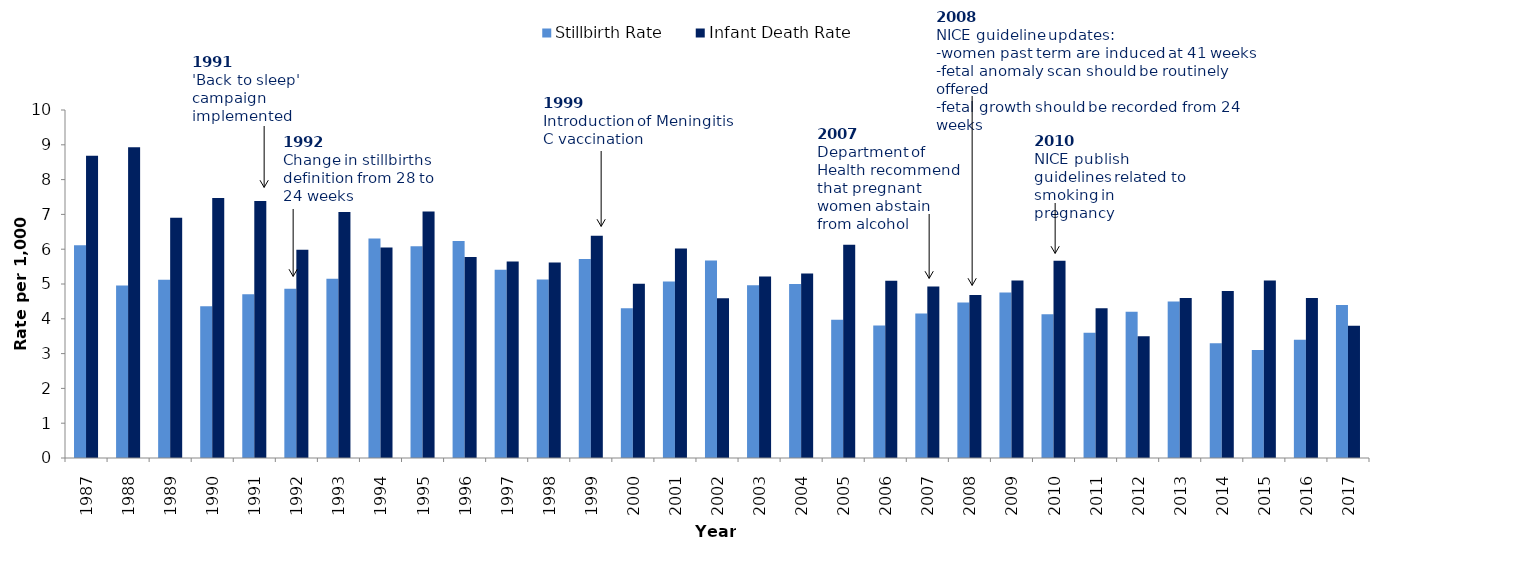
| Category | Stillbirth Rate | Infant Death Rate |
|---|---|---|
| 1987 | 6.11 | 8.685 |
| 1988 | 4.955 | 8.931 |
| 1989 | 5.122 | 6.902 |
| 1990 | 4.362 | 7.472 |
| 1991 | 4.703 | 7.386 |
| 1992 | 4.867 | 5.983 |
| 1993 | 5.151 | 7.066 |
| 1994 | 6.309 | 6.052 |
| 1995 | 6.083 | 7.083 |
| 1996 | 6.236 | 5.777 |
| 1997 | 5.409 | 5.643 |
| 1998 | 5.128 | 5.616 |
| 1999 | 5.717 | 6.387 |
| 2000 | 4.305 | 5.007 |
| 2001 | 5.074 | 6.022 |
| 2002 | 5.673 | 4.593 |
| 2003 | 4.964 | 5.214 |
| 2004 | 5 | 5.3 |
| 2005 | 3.97 | 6.128 |
| 2006 | 3.81 | 5.092 |
| 2007 | 4.154 | 4.926 |
| 2008 | 4.467 | 4.685 |
| 2009 | 4.754 | 5.101 |
| 2010 | 4.131 | 5.666 |
| 2011 | 3.6 | 4.3 |
| 2012 | 4.2 | 3.5 |
| 2013 | 4.5 | 4.6 |
| 2014 | 3.3 | 4.8 |
| 2015 | 3.1 | 5.1 |
| 2016 | 3.4 | 4.6 |
| 2017 | 4.4 | 3.8 |